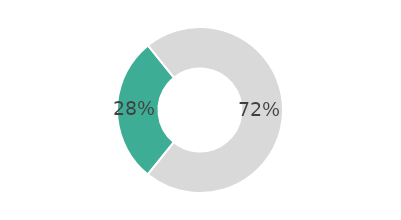
| Category | Series 0 |
|---|---|
| Ventes « live »  | 28.377 |
| Non | 71.623 |